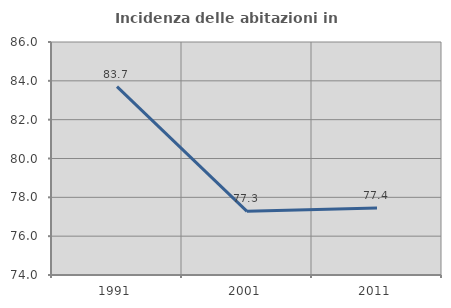
| Category | Incidenza delle abitazioni in proprietà  |
|---|---|
| 1991.0 | 83.702 |
| 2001.0 | 77.279 |
| 2011.0 | 77.445 |